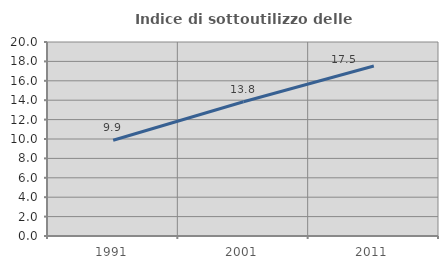
| Category | Indice di sottoutilizzo delle abitazioni  |
|---|---|
| 1991.0 | 9.875 |
| 2001.0 | 13.843 |
| 2011.0 | 17.521 |